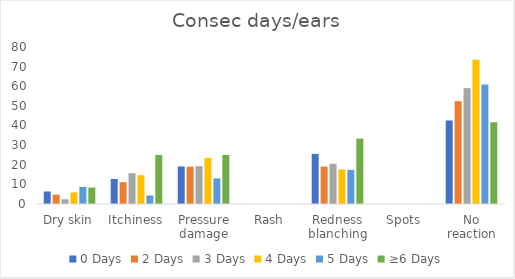
| Category | 0 Days | 2 Days | 3 Days | 4 Days | 5 Days | ≥6 Days |
|---|---|---|---|---|---|---|
| Dry skin | 6.383 | 4.762 | 2.41 | 5.882 | 8.696 | 8.333 |
| Itchiness | 12.766 | 11.111 | 15.663 | 14.706 | 4.348 | 25 |
| Pressure damage | 19.149 | 19.048 | 19.277 | 23.529 | 13.043 | 25 |
| Rash | 0 | 0 | 0 | 0 | 0 | 0 |
| Redness blanching | 25.532 | 19.048 | 20.482 | 17.647 | 17.391 | 33.333 |
| Spots | 0 | 0 | 0 | 0 | 0 | 0 |
| No reaction | 42.553 | 52.381 | 59.036 | 73.529 | 60.87 | 41.667 |